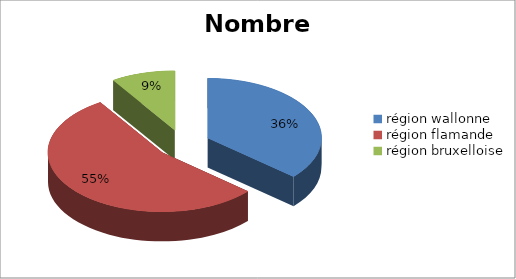
| Category | Series 0 |
|---|---|
| région wallonne | 4000000 |
| région flamande | 6000000 |
| région bruxelloise | 1000000 |